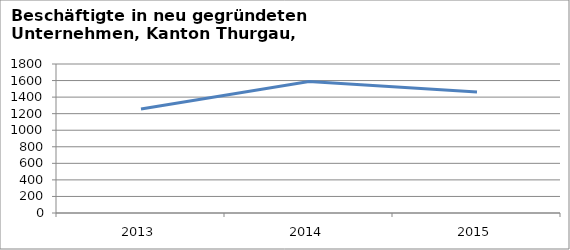
| Category | Sektoren 2 und 3 |
|---|---|
| 2013.0 | 1257 |
| 2014.0 | 1589 |
| 2015.0 | 1463 |